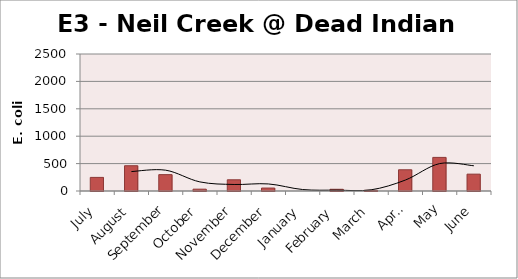
| Category | E. coli MPN |
|---|---|
| July | 248.1 |
| August | 461.1 |
| September | 298.7 |
| October | 33.5 |
| November | 204.6 |
| December | 53.7 |
| January | 0 |
| February | 31.3 |
| March | 12.1 |
| April | 387.3 |
| May | 613.1 |
| June | 307.6 |